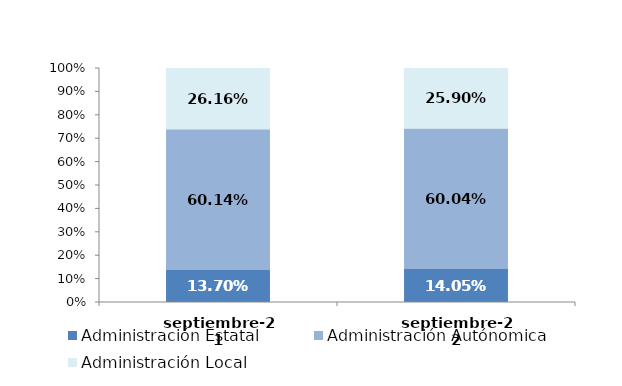
| Category | Administración Estatal | Administración Autónomica | Administración Local |
|---|---|---|---|
| 2021-09-01 | 0.137 | 0.601 | 0.262 |
| 2022-09-01 | 0.141 | 0.6 | 0.259 |